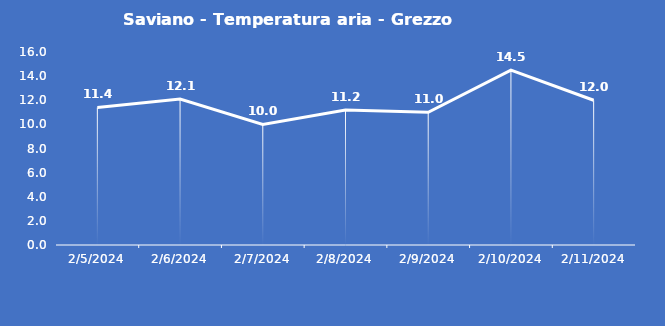
| Category | Saviano - Temperatura aria - Grezzo (°C) |
|---|---|
| 2/5/24 | 11.4 |
| 2/6/24 | 12.1 |
| 2/7/24 | 10 |
| 2/8/24 | 11.2 |
| 2/9/24 | 11 |
| 2/10/24 | 14.5 |
| 2/11/24 | 12 |